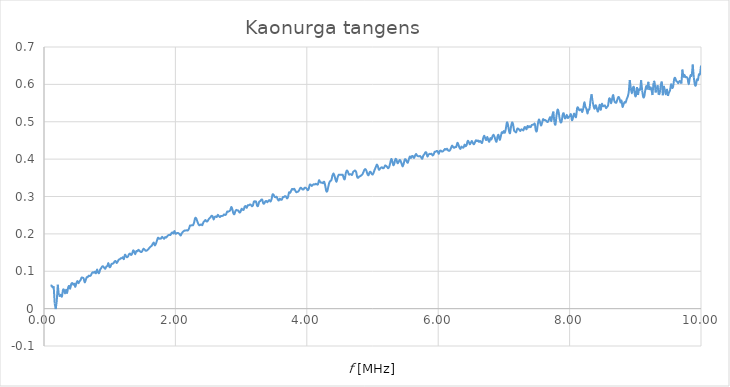
| Category | tan(d) |
|---|---|
| 0.1 | 0.061 |
| 0.115714285714286 | 0.061 |
| 0.131428571428571 | 0.057 |
| 0.14714285714285702 | 0.06 |
| 0.16285714285714298 | 0.014 |
| 0.178571428571429 | -0.001 |
| 0.194285714285714 | 0.02 |
| 0.21 | 0.064 |
| 0.225714285714286 | 0.036 |
| 0.24142857142857102 | 0.034 |
| 0.257142857142857 | 0.037 |
| 0.272857142857143 | 0.032 |
| 0.288571428571429 | 0.05 |
| 0.30428571428571405 | 0.05 |
| 0.32 | 0.04 |
| 0.33571428571428596 | 0.05 |
| 0.35142857142857103 | 0.042 |
| 0.367142857142857 | 0.056 |
| 0.382857142857143 | 0.061 |
| 0.39857142857142897 | 0.053 |
| 0.41428571428571404 | 0.066 |
| 0.43 | 0.068 |
| 0.44571428571428595 | 0.064 |
| 0.461428571428571 | 0.067 |
| 0.477142857142857 | 0.058 |
| 0.492857142857143 | 0.068 |
| 0.508571428571429 | 0.074 |
| 0.524285714285714 | 0.068 |
| 0.54 | 0.073 |
| 0.555714285714286 | 0.076 |
| 0.5714285714285711 | 0.083 |
| 0.5871428571428571 | 0.083 |
| 0.602857142857143 | 0.081 |
| 0.618571428571429 | 0.07 |
| 0.634285714285714 | 0.076 |
| 0.65 | 0.084 |
| 0.665714285714286 | 0.084 |
| 0.681428571428571 | 0.088 |
| 0.6971428571428571 | 0.087 |
| 0.712857142857143 | 0.089 |
| 0.728571428571429 | 0.095 |
| 0.744285714285714 | 0.097 |
| 0.76 | 0.096 |
| 0.775714285714286 | 0.099 |
| 0.791428571428571 | 0.095 |
| 0.807142857142857 | 0.105 |
| 0.822857142857143 | 0.097 |
| 0.838571428571429 | 0.095 |
| 0.854285714285714 | 0.104 |
| 0.87 | 0.108 |
| 0.885714285714286 | 0.113 |
| 0.901428571428571 | 0.113 |
| 0.917142857142857 | 0.109 |
| 0.9328571428571429 | 0.107 |
| 0.948571428571429 | 0.113 |
| 0.964285714285714 | 0.114 |
| 0.98 | 0.122 |
| 0.995714285714286 | 0.111 |
| 1.01142857142857 | 0.112 |
| 1.02714285714286 | 0.119 |
| 1.04285714285714 | 0.12 |
| 1.05857142857143 | 0.122 |
| 1.0742857142857098 | 0.126 |
| 1.09 | 0.127 |
| 1.10571428571429 | 0.122 |
| 1.1214285714285699 | 0.126 |
| 1.1371428571428601 | 0.131 |
| 1.15285714285714 | 0.132 |
| 1.16857142857143 | 0.135 |
| 1.18428571428571 | 0.135 |
| 1.2 | 0.137 |
| 1.2157142857142902 | 0.132 |
| 1.23142857142857 | 0.144 |
| 1.24714285714286 | 0.141 |
| 1.26285714285714 | 0.137 |
| 1.27857142857143 | 0.14 |
| 1.2942857142857098 | 0.146 |
| 1.31 | 0.147 |
| 1.32571428571429 | 0.143 |
| 1.3414285714285699 | 0.147 |
| 1.35714285714286 | 0.156 |
| 1.37285714285714 | 0.153 |
| 1.3885714285714301 | 0.146 |
| 1.40428571428571 | 0.154 |
| 1.42 | 0.153 |
| 1.4357142857142902 | 0.157 |
| 1.45142857142857 | 0.155 |
| 1.46714285714286 | 0.152 |
| 1.48285714285714 | 0.151 |
| 1.49857142857143 | 0.155 |
| 1.5142857142857098 | 0.16 |
| 1.53 | 0.158 |
| 1.54571428571429 | 0.155 |
| 1.56142857142857 | 0.155 |
| 1.57714285714286 | 0.157 |
| 1.5928571428571399 | 0.16 |
| 1.60857142857143 | 0.164 |
| 1.62428571428571 | 0.166 |
| 1.64 | 0.168 |
| 1.6557142857142901 | 0.174 |
| 1.67142857142857 | 0.176 |
| 1.6871428571428602 | 0.169 |
| 1.70285714285714 | 0.174 |
| 1.71857142857143 | 0.181 |
| 1.73428571428571 | 0.19 |
| 1.75 | 0.187 |
| 1.76571428571429 | 0.188 |
| 1.78142857142857 | 0.187 |
| 1.79714285714286 | 0.192 |
| 1.8128571428571398 | 0.189 |
| 1.82857142857143 | 0.187 |
| 1.8442857142857099 | 0.191 |
| 1.86 | 0.19 |
| 1.87571428571429 | 0.194 |
| 1.89142857142857 | 0.196 |
| 1.9071428571428601 | 0.198 |
| 1.92285714285714 | 0.197 |
| 1.93857142857143 | 0.202 |
| 1.95428571428571 | 0.204 |
| 1.97 | 0.201 |
| 1.9857142857142902 | 0.208 |
| 2.00142857142857 | 0.2 |
| 2.01714285714286 | 0.202 |
| 2.03285714285714 | 0.203 |
| 2.04857142857143 | 0.201 |
| 2.06428571428571 | 0.199 |
| 2.08 | 0.195 |
| 2.09571428571429 | 0.201 |
| 2.11142857142857 | 0.205 |
| 2.12714285714286 | 0.207 |
| 2.14285714285714 | 0.209 |
| 2.15857142857143 | 0.209 |
| 2.17428571428571 | 0.21 |
| 2.19 | 0.209 |
| 2.20571428571429 | 0.213 |
| 2.2214285714285698 | 0.222 |
| 2.23714285714286 | 0.222 |
| 2.25285714285714 | 0.223 |
| 2.26857142857143 | 0.223 |
| 2.28428571428571 | 0.23 |
| 2.3 | 0.242 |
| 2.3157142857142903 | 0.242 |
| 2.33142857142857 | 0.235 |
| 2.34714285714286 | 0.227 |
| 2.36285714285714 | 0.223 |
| 2.37857142857143 | 0.224 |
| 2.3942857142857097 | 0.225 |
| 2.41 | 0.224 |
| 2.42571428571429 | 0.231 |
| 2.44142857142857 | 0.234 |
| 2.45714285714286 | 0.237 |
| 2.4728571428571398 | 0.233 |
| 2.48857142857143 | 0.234 |
| 2.50428571428571 | 0.239 |
| 2.52 | 0.242 |
| 2.53571428571429 | 0.244 |
| 2.55142857142857 | 0.248 |
| 2.5671428571428603 | 0.246 |
| 2.58285714285714 | 0.238 |
| 2.59857142857143 | 0.245 |
| 2.61428571428571 | 0.246 |
| 2.63 | 0.245 |
| 2.64571428571429 | 0.251 |
| 2.66142857142857 | 0.248 |
| 2.67714285714286 | 0.245 |
| 2.69285714285714 | 0.248 |
| 2.70857142857143 | 0.248 |
| 2.7242857142857098 | 0.249 |
| 2.74 | 0.252 |
| 2.7557142857142902 | 0.25 |
| 2.77142857142857 | 0.252 |
| 2.78714285714286 | 0.26 |
| 2.80285714285714 | 0.259 |
| 2.81857142857143 | 0.261 |
| 2.83428571428571 | 0.263 |
| 2.85 | 0.272 |
| 2.86571428571429 | 0.266 |
| 2.88142857142857 | 0.256 |
| 2.89714285714286 | 0.252 |
| 2.91285714285714 | 0.261 |
| 2.92857142857143 | 0.264 |
| 2.94428571428571 | 0.262 |
| 2.96 | 0.262 |
| 2.97571428571429 | 0.257 |
| 2.9914285714285698 | 0.259 |
| 3.0071428571428602 | 0.267 |
| 3.02285714285714 | 0.265 |
| 3.03857142857143 | 0.265 |
| 3.05428571428571 | 0.273 |
| 3.07 | 0.274 |
| 3.0857142857142903 | 0.27 |
| 3.10142857142857 | 0.276 |
| 3.11714285714286 | 0.277 |
| 3.13285714285714 | 0.278 |
| 3.14857142857143 | 0.278 |
| 3.1642857142857097 | 0.274 |
| 3.18 | 0.276 |
| 3.19571428571429 | 0.287 |
| 3.21142857142857 | 0.286 |
| 3.22714285714286 | 0.286 |
| 3.2428571428571398 | 0.276 |
| 3.2585714285714302 | 0.275 |
| 3.27428571428571 | 0.286 |
| 3.29 | 0.287 |
| 3.30571428571429 | 0.291 |
| 3.32142857142857 | 0.291 |
| 3.33714285714286 | 0.282 |
| 3.35285714285714 | 0.281 |
| 3.36857142857143 | 0.287 |
| 3.38428571428571 | 0.288 |
| 3.4 | 0.285 |
| 3.41571428571429 | 0.289 |
| 3.43142857142857 | 0.29 |
| 3.44714285714286 | 0.286 |
| 3.46285714285714 | 0.292 |
| 3.47857142857143 | 0.305 |
| 3.4942857142857098 | 0.305 |
| 3.51 | 0.299 |
| 3.5257142857142902 | 0.298 |
| 3.54142857142857 | 0.299 |
| 3.55714285714286 | 0.292 |
| 3.57285714285714 | 0.289 |
| 3.58857142857143 | 0.294 |
| 3.60428571428571 | 0.291 |
| 3.62 | 0.292 |
| 3.63571428571429 | 0.298 |
| 3.65142857142857 | 0.299 |
| 3.66714285714286 | 0.301 |
| 3.6828571428571397 | 0.3 |
| 3.69857142857143 | 0.295 |
| 3.71428571428571 | 0.299 |
| 3.73 | 0.311 |
| 3.74571428571429 | 0.31 |
| 3.76142857142857 | 0.315 |
| 3.7771428571428602 | 0.32 |
| 3.79285714285714 | 0.318 |
| 3.80857142857143 | 0.321 |
| 3.82428571428571 | 0.316 |
| 3.84 | 0.312 |
| 3.8557142857142903 | 0.312 |
| 3.87142857142857 | 0.314 |
| 3.88714285714286 | 0.318 |
| 3.90285714285714 | 0.323 |
| 3.91857142857143 | 0.322 |
| 3.9342857142857097 | 0.319 |
| 3.95 | 0.319 |
| 3.96571428571429 | 0.323 |
| 3.98142857142857 | 0.323 |
| 3.99714285714286 | 0.321 |
| 4.01285714285714 | 0.317 |
| 4.02857142857143 | 0.32 |
| 4.04428571428571 | 0.331 |
| 4.06 | 0.331 |
| 4.07571428571429 | 0.328 |
| 4.09142857142857 | 0.331 |
| 4.10714285714286 | 0.333 |
| 4.12285714285714 | 0.332 |
| 4.13857142857143 | 0.334 |
| 4.1542857142857095 | 0.332 |
| 4.17 | 0.333 |
| 4.18571428571429 | 0.343 |
| 4.20142857142857 | 0.34 |
| 4.21714285714286 | 0.337 |
| 4.2328571428571395 | 0.337 |
| 4.24857142857143 | 0.336 |
| 4.26428571428571 | 0.339 |
| 4.28 | 0.329 |
| 4.29571428571429 | 0.315 |
| 4.31142857142857 | 0.314 |
| 4.32714285714286 | 0.326 |
| 4.34285714285714 | 0.337 |
| 4.35857142857143 | 0.342 |
| 4.37428571428571 | 0.344 |
| 4.39 | 0.356 |
| 4.40571428571429 | 0.362 |
| 4.42142857142857 | 0.355 |
| 4.43714285714286 | 0.345 |
| 4.45285714285714 | 0.34 |
| 4.46857142857143 | 0.351 |
| 4.4842857142857095 | 0.358 |
| 4.5 | 0.358 |
| 4.5157142857142905 | 0.358 |
| 4.53142857142857 | 0.358 |
| 4.54714285714286 | 0.358 |
| 4.56285714285714 | 0.349 |
| 4.57857142857143 | 0.347 |
| 4.59428571428571 | 0.363 |
| 4.61 | 0.37 |
| 4.62571428571429 | 0.366 |
| 4.64142857142857 | 0.359 |
| 4.65714285714286 | 0.36 |
| 4.67285714285714 | 0.359 |
| 4.68857142857143 | 0.358 |
| 4.70428571428571 | 0.365 |
| 4.72 | 0.368 |
| 4.73571428571429 | 0.369 |
| 4.75142857142857 | 0.365 |
| 4.7671428571428605 | 0.352 |
| 4.78285714285714 | 0.35 |
| 4.79857142857143 | 0.354 |
| 4.81428571428571 | 0.354 |
| 4.83 | 0.357 |
| 4.8457142857142905 | 0.359 |
| 4.86142857142857 | 0.365 |
| 4.87714285714286 | 0.372 |
| 4.89285714285714 | 0.373 |
| 4.90857142857143 | 0.368 |
| 4.92428571428571 | 0.359 |
| 4.94 | 0.357 |
| 4.95571428571429 | 0.365 |
| 4.97142857142857 | 0.366 |
| 4.98714285714286 | 0.361 |
| 5.00285714285714 | 0.359 |
| 5.0185714285714305 | 0.364 |
| 5.03428571428571 | 0.372 |
| 5.05 | 0.378 |
| 5.06571428571429 | 0.385 |
| 5.08142857142857 | 0.381 |
| 5.09714285714286 | 0.372 |
| 5.11285714285714 | 0.374 |
| 5.12857142857143 | 0.377 |
| 5.14428571428571 | 0.378 |
| 5.16 | 0.375 |
| 5.17571428571429 | 0.377 |
| 5.19142857142857 | 0.383 |
| 5.20714285714286 | 0.382 |
| 5.22285714285714 | 0.379 |
| 5.23857142857143 | 0.376 |
| 5.25428571428571 | 0.38 |
| 5.27 | 0.39 |
| 5.28571428571429 | 0.4 |
| 5.30142857142857 | 0.395 |
| 5.31714285714286 | 0.384 |
| 5.33285714285714 | 0.389 |
| 5.34857142857143 | 0.4 |
| 5.36428571428571 | 0.399 |
| 5.38 | 0.389 |
| 5.39571428571429 | 0.392 |
| 5.41142857142857 | 0.397 |
| 5.42714285714286 | 0.396 |
| 5.4428571428571395 | 0.388 |
| 5.45857142857143 | 0.38 |
| 5.47428571428571 | 0.387 |
| 5.49 | 0.399 |
| 5.50571428571429 | 0.399 |
| 5.52142857142857 | 0.394 |
| 5.53714285714286 | 0.39 |
| 5.55285714285714 | 0.399 |
| 5.56857142857143 | 0.407 |
| 5.58428571428571 | 0.403 |
| 5.6 | 0.408 |
| 5.61571428571429 | 0.408 |
| 5.63142857142857 | 0.403 |
| 5.64714285714286 | 0.409 |
| 5.66285714285714 | 0.414 |
| 5.67857142857143 | 0.41 |
| 5.6942857142857095 | 0.408 |
| 5.71 | 0.408 |
| 5.72571428571429 | 0.408 |
| 5.74142857142857 | 0.405 |
| 5.75714285714286 | 0.401 |
| 5.77285714285714 | 0.409 |
| 5.78857142857143 | 0.413 |
| 5.80428571428571 | 0.418 |
| 5.82 | 0.417 |
| 5.83571428571429 | 0.407 |
| 5.85142857142857 | 0.412 |
| 5.86714285714286 | 0.414 |
| 5.88285714285714 | 0.413 |
| 5.89857142857143 | 0.414 |
| 5.91428571428571 | 0.41 |
| 5.93 | 0.412 |
| 5.94571428571429 | 0.42 |
| 5.96142857142857 | 0.42 |
| 5.97714285714286 | 0.422 |
| 5.99285714285714 | 0.42 |
| 6.00857142857143 | 0.414 |
| 6.02428571428571 | 0.422 |
| 6.04 | 0.423 |
| 6.0557142857142905 | 0.42 |
| 6.07142857142857 | 0.421 |
| 6.08714285714286 | 0.424 |
| 6.10285714285714 | 0.427 |
| 6.11857142857143 | 0.425 |
| 6.13428571428571 | 0.428 |
| 6.15 | 0.424 |
| 6.16571428571429 | 0.422 |
| 6.18142857142857 | 0.424 |
| 6.19714285714286 | 0.431 |
| 6.21285714285714 | 0.436 |
| 6.22857142857143 | 0.432 |
| 6.24428571428571 | 0.43 |
| 6.26 | 0.433 |
| 6.27571428571429 | 0.433 |
| 6.29142857142857 | 0.443 |
| 6.3071428571428605 | 0.439 |
| 6.32285714285714 | 0.431 |
| 6.33857142857143 | 0.427 |
| 6.35428571428571 | 0.433 |
| 6.37 | 0.431 |
| 6.38571428571429 | 0.431 |
| 6.40142857142857 | 0.439 |
| 6.41714285714286 | 0.434 |
| 6.43285714285714 | 0.438 |
| 6.44857142857143 | 0.449 |
| 6.46428571428571 | 0.446 |
| 6.48 | 0.44 |
| 6.49571428571429 | 0.443 |
| 6.51142857142857 | 0.449 |
| 6.52714285714286 | 0.443 |
| 6.54285714285714 | 0.44 |
| 6.55857142857143 | 0.445 |
| 6.57428571428571 | 0.45 |
| 6.59 | 0.448 |
| 6.60571428571429 | 0.45 |
| 6.62142857142857 | 0.446 |
| 6.63714285714286 | 0.449 |
| 6.65285714285714 | 0.445 |
| 6.66857142857143 | 0.444 |
| 6.68428571428571 | 0.456 |
| 6.7 | 0.463 |
| 6.71571428571429 | 0.456 |
| 6.7314285714285695 | 0.451 |
| 6.74714285714286 | 0.46 |
| 6.76285714285714 | 0.451 |
| 6.77857142857143 | 0.446 |
| 6.79428571428571 | 0.456 |
| 6.81 | 0.453 |
| 6.82571428571429 | 0.461 |
| 6.84142857142857 | 0.465 |
| 6.85714285714286 | 0.46 |
| 6.87285714285714 | 0.451 |
| 6.88857142857143 | 0.447 |
| 6.9042857142857095 | 0.462 |
| 6.92 | 0.464 |
| 6.93571428571429 | 0.452 |
| 6.95142857142857 | 0.46 |
| 6.96714285714286 | 0.471 |
| 6.9828571428571395 | 0.47 |
| 6.99857142857143 | 0.475 |
| 7.01428571428571 | 0.471 |
| 7.03 | 0.482 |
| 7.04571428571429 | 0.498 |
| 7.06142857142857 | 0.492 |
| 7.07714285714286 | 0.476 |
| 7.09285714285714 | 0.469 |
| 7.10857142857143 | 0.487 |
| 7.12428571428571 | 0.498 |
| 7.14 | 0.493 |
| 7.15571428571429 | 0.476 |
| 7.17142857142857 | 0.473 |
| 7.18714285714286 | 0.472 |
| 7.20285714285714 | 0.481 |
| 7.21857142857143 | 0.481 |
| 7.2342857142857095 | 0.478 |
| 7.25 | 0.475 |
| 7.2657142857142905 | 0.48 |
| 7.28142857142857 | 0.479 |
| 7.29714285714286 | 0.477 |
| 7.31285714285714 | 0.485 |
| 7.32857142857143 | 0.485 |
| 7.34428571428571 | 0.48 |
| 7.36 | 0.489 |
| 7.37571428571429 | 0.485 |
| 7.39142857142857 | 0.488 |
| 7.40714285714286 | 0.486 |
| 7.42285714285714 | 0.491 |
| 7.43857142857143 | 0.492 |
| 7.45428571428571 | 0.493 |
| 7.47 | 0.494 |
| 7.48571428571429 | 0.477 |
| 7.50142857142857 | 0.475 |
| 7.5171428571428605 | 0.495 |
| 7.53285714285714 | 0.506 |
| 7.54857142857143 | 0.499 |
| 7.56428571428571 | 0.49 |
| 7.58 | 0.497 |
| 7.5957142857142905 | 0.507 |
| 7.61142857142857 | 0.504 |
| 7.62714285714286 | 0.505 |
| 7.64285714285714 | 0.503 |
| 7.65857142857143 | 0.5 |
| 7.67428571428571 | 0.501 |
| 7.69 | 0.508 |
| 7.70571428571429 | 0.512 |
| 7.72142857142857 | 0.502 |
| 7.73714285714286 | 0.517 |
| 7.75285714285714 | 0.527 |
| 7.7685714285714305 | 0.498 |
| 7.78428571428571 | 0.492 |
| 7.8 | 0.515 |
| 7.81571428571429 | 0.532 |
| 7.83142857142857 | 0.527 |
| 7.84714285714286 | 0.51 |
| 7.86285714285714 | 0.499 |
| 7.87857142857143 | 0.501 |
| 7.89428571428571 | 0.518 |
| 7.91 | 0.523 |
| 7.92571428571429 | 0.51 |
| 7.94142857142857 | 0.511 |
| 7.95714285714286 | 0.518 |
| 7.97285714285714 | 0.51 |
| 7.98857142857143 | 0.513 |
| 8.00428571428571 | 0.516 |
| 8.02 | 0.52 |
| 8.03571428571429 | 0.504 |
| 8.05142857142857 | 0.51 |
| 8.06714285714286 | 0.522 |
| 8.08285714285714 | 0.516 |
| 8.09857142857143 | 0.513 |
| 8.11428571428571 | 0.536 |
| 8.13 | 0.538 |
| 8.14571428571429 | 0.531 |
| 8.16142857142857 | 0.532 |
| 8.17714285714286 | 0.533 |
| 8.19285714285714 | 0.526 |
| 8.20857142857143 | 0.536 |
| 8.22428571428571 | 0.552 |
| 8.24 | 0.541 |
| 8.25571428571429 | 0.535 |
| 8.27142857142857 | 0.522 |
| 8.287142857142861 | 0.532 |
| 8.30285714285714 | 0.535 |
| 8.31857142857143 | 0.558 |
| 8.33428571428571 | 0.574 |
| 8.35 | 0.555 |
| 8.36571428571429 | 0.541 |
| 8.38142857142857 | 0.535 |
| 8.39714285714286 | 0.544 |
| 8.41285714285714 | 0.537 |
| 8.428571428571429 | 0.527 |
| 8.44428571428571 | 0.535 |
| 8.46 | 0.546 |
| 8.47571428571429 | 0.532 |
| 8.491428571428571 | 0.548 |
| 8.50714285714286 | 0.542 |
| 8.52285714285714 | 0.542 |
| 8.538571428571428 | 0.543 |
| 8.554285714285712 | 0.537 |
| 8.57 | 0.54 |
| 8.585714285714289 | 0.544 |
| 8.60142857142857 | 0.562 |
| 8.61714285714286 | 0.56 |
| 8.63285714285714 | 0.55 |
| 8.64857142857143 | 0.563 |
| 8.664285714285711 | 0.571 |
| 8.68 | 0.556 |
| 8.695714285714288 | 0.552 |
| 8.711428571428572 | 0.551 |
| 8.72714285714286 | 0.56 |
| 8.74285714285714 | 0.566 |
| 8.758571428571429 | 0.563 |
| 8.77428571428571 | 0.552 |
| 8.79 | 0.557 |
| 8.80571428571429 | 0.54 |
| 8.821428571428571 | 0.547 |
| 8.83714285714286 | 0.552 |
| 8.85285714285714 | 0.551 |
| 8.868571428571428 | 0.56 |
| 8.884285714285712 | 0.567 |
| 8.9 | 0.579 |
| 8.915714285714289 | 0.612 |
| 8.93142857142857 | 0.59 |
| 8.94714285714286 | 0.576 |
| 8.962857142857139 | 0.59 |
| 8.97857142857143 | 0.593 |
| 8.994285714285711 | 0.572 |
| 9.01 | 0.57 |
| 9.025714285714288 | 0.593 |
| 9.04142857142857 | 0.572 |
| 9.05714285714286 | 0.589 |
| 9.07285714285714 | 0.586 |
| 9.088571428571429 | 0.611 |
| 9.10428571428571 | 0.584 |
| 9.12 | 0.567 |
| 9.13571428571429 | 0.567 |
| 9.151428571428571 | 0.584 |
| 9.16714285714286 | 0.595 |
| 9.18285714285714 | 0.588 |
| 9.198571428571428 | 0.607 |
| 9.21428571428571 | 0.585 |
| 9.23 | 0.592 |
| 9.245714285714289 | 0.587 |
| 9.26142857142857 | 0.571 |
| 9.27714285714286 | 0.604 |
| 9.29285714285714 | 0.606 |
| 9.30857142857143 | 0.578 |
| 9.324285714285711 | 0.586 |
| 9.34 | 0.598 |
| 9.355714285714289 | 0.572 |
| 9.37142857142857 | 0.577 |
| 9.38714285714286 | 0.598 |
| 9.40285714285714 | 0.607 |
| 9.418571428571429 | 0.571 |
| 9.43428571428571 | 0.596 |
| 9.45 | 0.585 |
| 9.46571428571429 | 0.574 |
| 9.481428571428571 | 0.588 |
| 9.49714285714286 | 0.569 |
| 9.51285714285714 | 0.578 |
| 9.528571428571428 | 0.584 |
| 9.54428571428571 | 0.6 |
| 9.56 | 0.591 |
| 9.57571428571429 | 0.594 |
| 9.59142857142857 | 0.614 |
| 9.60714285714286 | 0.617 |
| 9.62285714285714 | 0.609 |
| 9.63857142857143 | 0.607 |
| 9.654285714285711 | 0.603 |
| 9.67 | 0.608 |
| 9.685714285714289 | 0.608 |
| 9.70142857142857 | 0.602 |
| 9.71714285714286 | 0.64 |
| 9.73285714285714 | 0.618 |
| 9.748571428571429 | 0.625 |
| 9.76428571428571 | 0.62 |
| 9.78 | 0.619 |
| 9.79571428571429 | 0.616 |
| 9.811428571428571 | 0.601 |
| 9.82714285714286 | 0.615 |
| 9.84285714285714 | 0.625 |
| 9.858571428571429 | 0.624 |
| 9.87428571428571 | 0.653 |
| 9.89 | 0.619 |
| 9.90571428571429 | 0.6 |
| 9.92142857142857 | 0.597 |
| 9.93714285714286 | 0.613 |
| 9.95285714285714 | 0.611 |
| 9.96857142857143 | 0.627 |
| 9.984285714285711 | 0.627 |
| 10.0 | 0.65 |